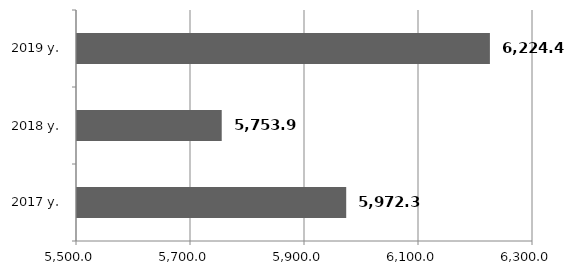
| Category | Series 0 |
|---|---|
| 2017 y. | 5972.3 |
| 2018 y. | 5753.9 |
| 2019 y. | 6224.4 |